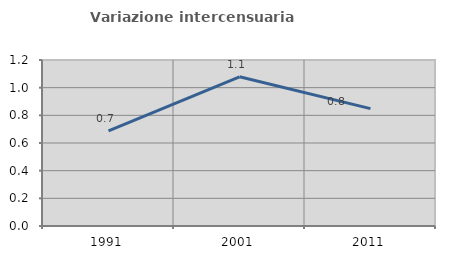
| Category | Variazione intercensuaria annua |
|---|---|
| 1991.0 | 0.688 |
| 2001.0 | 1.079 |
| 2011.0 | 0.848 |